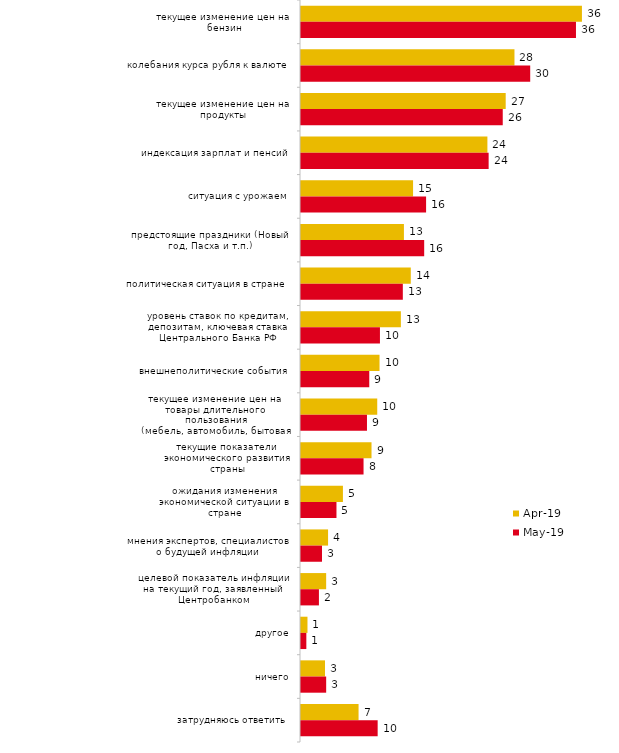
| Category | апр.19 | май.19 |
|---|---|---|
| текущее изменение цен на бензин | 36.485 | 35.711 |
| колебания курса рубля к валюте | 27.723 | 29.767 |
| текущее изменение цен на продукты | 26.584 | 26.201 |
| индексация зарплат и пенсий | 24.208 | 24.368 |
| ситуация с урожаем | 14.554 | 16.246 |
| предстоящие праздники (Новый год, Пасха и т.п.) | 13.366 | 15.998 |
| политическая ситуация в стране | 14.257 | 13.224 |
| уровень ставок по кредитам, депозитам, ключевая ставка Центрального Банка РФ | 12.97 | 10.253 |
| внешнеполитические события | 10.198 | 8.866 |
| текущее изменение цен на товары длительного пользования (мебель, автомобиль, бытовая техника и т.п.) | 9.901 | 8.569 |
| текущие показатели экономического развития страны | 9.158 | 8.123 |
| ожидания изменения экономической ситуации в стране | 5.446 | 4.606 |
| мнения экспертов, специалистов о будущей инфляции | 3.515 | 2.724 |
| целевой показатель инфляции на текущий год, заявленный Центробанком | 3.267 | 2.328 |
| другое | 0.842 | 0.693 |
| ничего | 3.119 | 3.269 |
| затрудняюсь ответить | 7.475 | 9.955 |